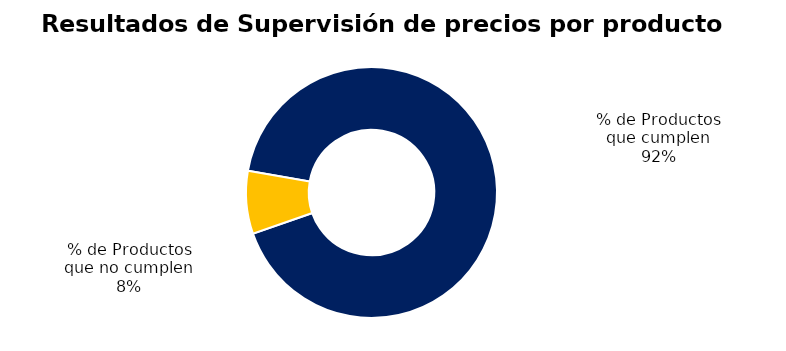
| Category | Series 0 |
|---|---|
| % de Productos que cumplen | 159 |
| % de Productos que no cumplen | 14 |